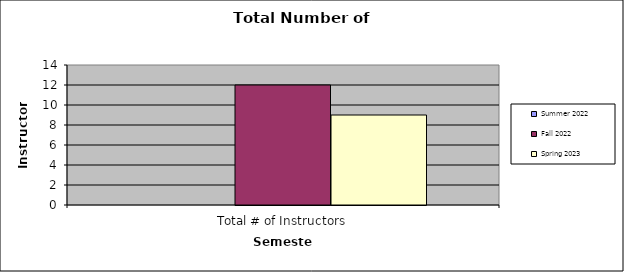
| Category | Summer 2022 | Fall 2022 | Spring 2023 |
|---|---|---|---|
| Total # of Instructors | 0 | 12 | 9 |